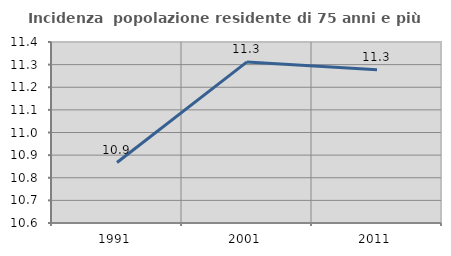
| Category | Incidenza  popolazione residente di 75 anni e più |
|---|---|
| 1991.0 | 10.867 |
| 2001.0 | 11.312 |
| 2011.0 | 11.278 |